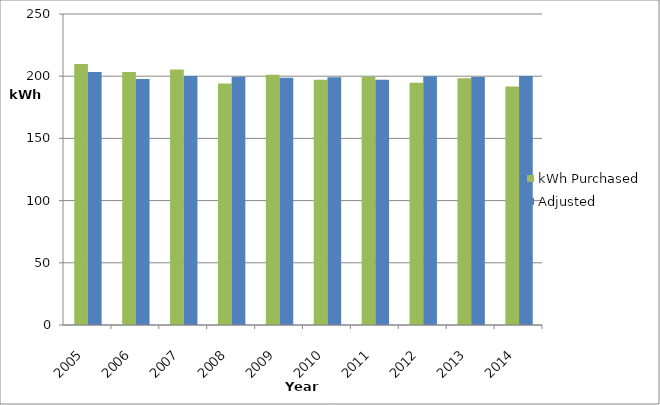
| Category | kWh Purchased | Adjusted |
|---|---|---|
| 2005.0 | 209871328.751 | 203293901.56 |
| 2006.0 | 203367791.46 | 197705360.173 |
| 2007.0 | 205302856.46 | 200129976.477 |
| 2008.0 | 194146899.859 | 199499870.716 |
| 2009.0 | 201115656.46 | 198852587.202 |
| 2010.0 | 197081317.463 | 199110325.826 |
| 2011.0 | 199623009.438 | 197163923.491 |
| 2012.0 | 194771161.25 | 200033688.737 |
| 2013.0 | 198259056.015 | 199265600.471 |
| 2014.0 | 191637148.36 | 200120990.863 |